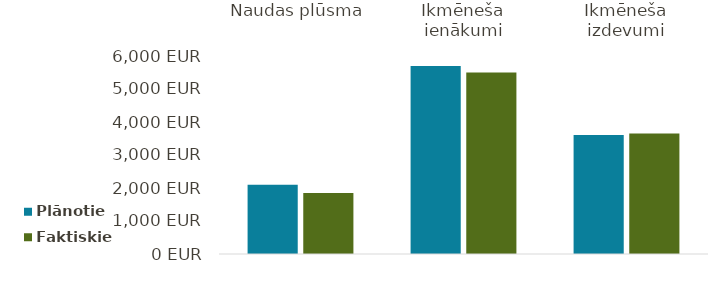
| Category | Plānotie | Faktiskie |
|---|---|---|
| Naudas plūsma | 2097 | 1845 |
| Ikmēneša ienākumi | 5700 | 5500 |
| Ikmēneša izdevumi | 3603 | 3655 |